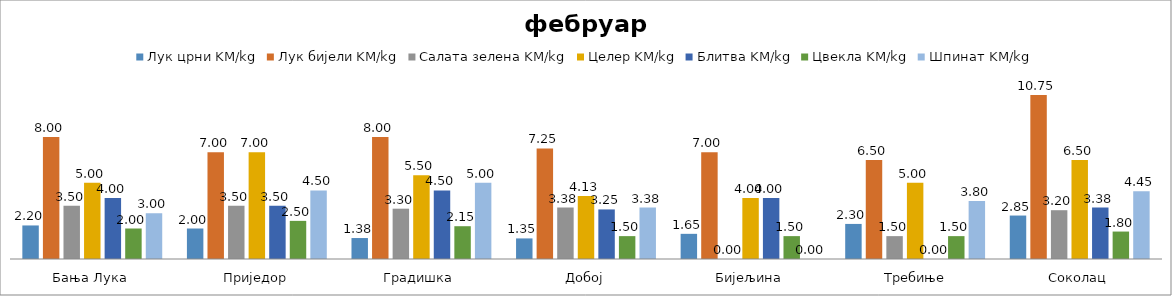
| Category | Лук црни KM/kg | Лук бијели KM/kg | Салата зелена KM/kg | Целер KM/kg | Блитва KM/kg | Цвекла KM/kg | Шпинат KM/kg |
|---|---|---|---|---|---|---|---|
| Бања Лука | 2.2 | 8 | 3.5 | 5 | 4 | 2 | 3 |
| Приједор | 2 | 7 | 3.5 | 7 | 3.5 | 2.5 | 4.5 |
| Градишка | 1.375 | 8 | 3.3 | 5.5 | 4.5 | 2.15 | 5 |
| Добој | 1.35 | 7.25 | 3.375 | 4.125 | 3.25 | 1.5 | 3.375 |
| Бијељина | 1.65 | 7 | 0 | 4 | 4 | 1.5 | 0 |
|  Требиње | 2.3 | 6.5 | 1.5 | 5 | 0 | 1.5 | 3.8 |
| Соколац | 2.85 | 10.75 | 3.2 | 6.5 | 3.375 | 1.8 | 4.45 |